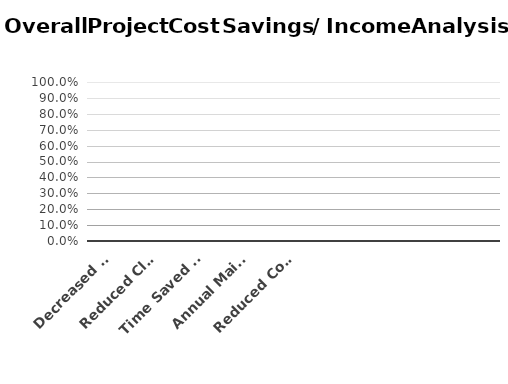
| Category | Series 0 |
|---|---|
| Decreased Helpdesk Support | 0 |
| Reduced Clerical Staff | 0 |
| Time Saved - Manual Creation of Reports | 0 |
| Annual Maintenance | 0 |
| Reduced Consumables  | 0 |